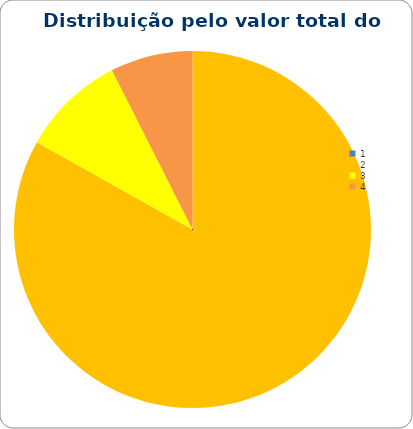
| Category | Series 0 |
|---|---|
| 0 | 0 |
| 1 | 0.831 |
| 2 | 0.094 |
| 3 | 0.075 |